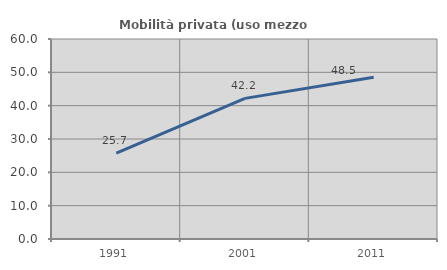
| Category | Mobilità privata (uso mezzo privato) |
|---|---|
| 1991.0 | 25.737 |
| 2001.0 | 42.185 |
| 2011.0 | 48.502 |